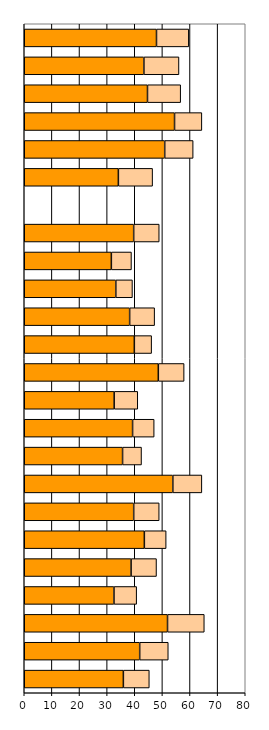
| Category | Series 0 | Series 1 |
|---|---|---|
| 0 | 35.878 | 9.394 |
| 1 | 41.793 | 10.345 |
| 2 | 51.864 | 13.311 |
| 3 | 32.482 | 8.211 |
| 4 | 38.673 | 9.203 |
| 5 | 43.475 | 7.889 |
| 6 | 39.616 | 9.236 |
| 7 | 53.785 | 10.511 |
| 8 | 35.591 | 6.863 |
| 9 | 39.215 | 7.814 |
| 10 | 32.55 | 8.546 |
| 11 | 48.535 | 9.337 |
| 12 | 39.852 | 6.257 |
| 13 | 38.152 | 9.046 |
| 14 | 33.145 | 6.019 |
| 15 | 31.532 | 7.277 |
| 16 | 39.613 | 9.25 |
| 17 | 0 | 0 |
| 18 | 34.072 | 12.39 |
| 19 | 50.846 | 10.292 |
| 20 | 54.403 | 9.891 |
| 21 | 44.613 | 12.011 |
| 22 | 43.31 | 12.7 |
| 23 | 47.873 | 11.699 |